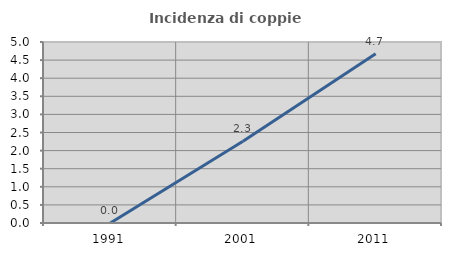
| Category | Incidenza di coppie miste |
|---|---|
| 1991.0 | 0 |
| 2001.0 | 2.256 |
| 2011.0 | 4.678 |